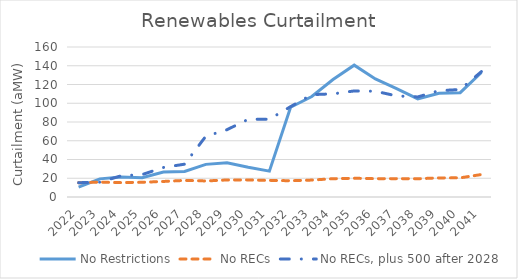
| Category | No Restrictions | No RECs | No RECs, plus 500 after 2028 |
|---|---|---|---|
| 2022.0 | 10.619 | 15.236 | 15.236 |
| 2023.0 | 19.353 | 15.844 | 15.844 |
| 2024.0 | 21.384 | 15.332 | 22.599 |
| 2025.0 | 20.595 | 15.721 | 23.931 |
| 2026.0 | 26.622 | 16.575 | 31.503 |
| 2027.0 | 27.179 | 17.712 | 35.007 |
| 2028.0 | 34.817 | 17.123 | 64.771 |
| 2029.0 | 36.403 | 18.173 | 71.783 |
| 2030.0 | 31.746 | 18.231 | 82.889 |
| 2031.0 | 27.624 | 17.713 | 82.936 |
| 2032.0 | 95.694 | 17.368 | 96.39 |
| 2033.0 | 107.155 | 18.051 | 109.179 |
| 2034.0 | 125.261 | 19.523 | 110.045 |
| 2035.0 | 140.618 | 19.982 | 113.133 |
| 2036.0 | 125.885 | 19.553 | 112.814 |
| 2037.0 | 115.65 | 19.597 | 107.829 |
| 2038.0 | 104.734 | 19.476 | 106.734 |
| 2039.0 | 110.74 | 20.379 | 113.431 |
| 2040.0 | 111.282 | 20.425 | 114.648 |
| 2041.0 | 132.797 | 23.987 | 133.729 |